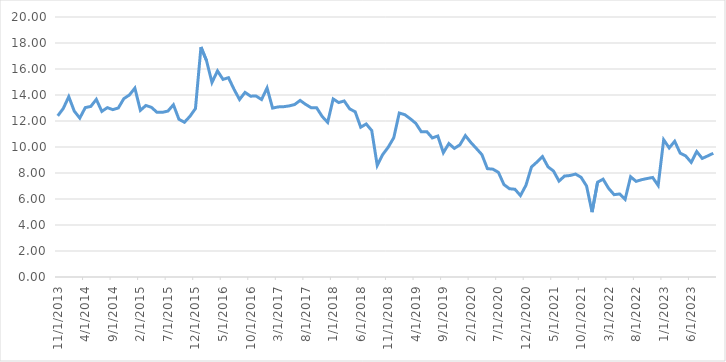
| Category | Series 0 |
|---|---|
| 11/1/13 | 12.396 |
| 12/1/13 | 12.961 |
| 1/1/14 | 13.872 |
| 2/1/14 | 12.758 |
| 3/1/14 | 12.226 |
| 4/1/14 | 13.032 |
| 5/1/14 | 13.12 |
| 6/1/14 | 13.663 |
| 7/1/14 | 12.741 |
| 8/1/14 | 13.027 |
| 9/1/14 | 12.874 |
| 10/1/14 | 13.005 |
| 11/1/14 | 13.722 |
| 12/1/14 | 13.999 |
| 1/1/15 | 14.531 |
| 2/1/15 | 12.818 |
| 3/1/15 | 13.195 |
| 4/1/15 | 13.054 |
| 5/1/15 | 12.671 |
| 6/1/15 | 12.665 |
| 7/1/15 | 12.764 |
| 8/1/15 | 13.248 |
| 9/1/15 | 12.132 |
| 10/1/15 | 11.903 |
| 11/1/15 | 12.361 |
| 12/1/15 | 12.958 |
| 1/1/16 | 17.691 |
| 2/1/16 | 16.652 |
| 3/1/16 | 14.964 |
| 4/1/16 | 15.853 |
| 5/1/16 | 15.202 |
| 6/1/16 | 15.332 |
| 7/1/16 | 14.438 |
| 8/1/16 | 13.652 |
| 9/1/16 | 14.201 |
| 10/1/16 | 13.911 |
| 11/1/16 | 13.919 |
| 12/1/16 | 13.652 |
| 1/1/17 | 14.542 |
| 2/1/17 | 12.994 |
| 3/1/17 | 13.084 |
| 4/1/17 | 13.1 |
| 5/1/17 | 13.161 |
| 6/1/17 | 13.268 |
| 7/1/17 | 13.582 |
| 8/1/17 | 13.28 |
| 9/1/17 | 13.023 |
| 10/1/17 | 13.016 |
| 11/1/17 | 12.352 |
| 12/1/17 | 11.894 |
| 1/1/18 | 13.695 |
| 2/1/18 | 13.419 |
| 3/1/18 | 13.541 |
| 4/1/18 | 12.932 |
| 5/1/18 | 12.707 |
| 6/1/18 | 11.522 |
| 7/1/18 | 11.772 |
| 8/1/18 | 11.266 |
| 9/1/18 | 8.588 |
| 10/1/18 | 9.424 |
| 11/1/18 | 9.989 |
| 12/1/18 | 10.713 |
| 1/1/19 | 12.613 |
| 2/1/19 | 12.487 |
| 3/1/19 | 12.173 |
| 4/1/19 | 11.819 |
| 5/1/19 | 11.166 |
| 6/1/19 | 11.181 |
| 7/1/19 | 10.697 |
| 8/1/19 | 10.847 |
| 9/1/19 | 9.559 |
| 10/1/19 | 10.267 |
| 11/1/19 | 9.895 |
| 12/1/19 | 10.162 |
| 1/1/20 | 10.876 |
| 2/1/20 | 10.344 |
| 3/1/20 | 9.886 |
| 4/1/20 | 9.413 |
| 5/1/20 | 8.334 |
| 6/1/20 | 8.295 |
| 7/1/20 | 8.05 |
| 8/1/20 | 7.111 |
| 9/1/20 | 6.793 |
| 10/1/20 | 6.748 |
| 11/1/20 | 6.263 |
| 12/1/20 | 7.06 |
| 1/1/21 | 8.464 |
| 2/1/21 | 8.845 |
| 3/1/21 | 9.26 |
| 4/1/21 | 8.476 |
| 5/1/21 | 8.15 |
| 6/1/21 | 7.378 |
| 7/1/21 | 7.764 |
| 8/1/21 | 7.807 |
| 9/1/21 | 7.919 |
| 10/1/21 | 7.671 |
| 11/1/21 | 7.001 |
| 12/1/21 | 4.991 |
| 1/1/22 | 7.293 |
| 2/1/22 | 7.524 |
| 3/1/22 | 6.821 |
| 4/1/22 | 6.333 |
| 5/1/22 | 6.387 |
| 6/1/22 | 5.977 |
| 7/1/22 | 7.712 |
| 8/1/22 | 7.357 |
| 9/1/22 | 7.486 |
| 10/1/22 | 7.576 |
| 11/1/22 | 7.656 |
| 12/1/22 | 7.042 |
| 1/1/23 | 10.556 |
| 2/1/23 | 9.927 |
| 3/1/23 | 10.44 |
| 4/1/23 | 9.524 |
| 5/1/23 | 9.312 |
| 6/1/23 | 8.818 |
| 7/1/23 | 9.65 |
| 8/1/23 | 9.121 |
| 9/1/23 | 9.314 |
| 10/1/23 | 9.517 |